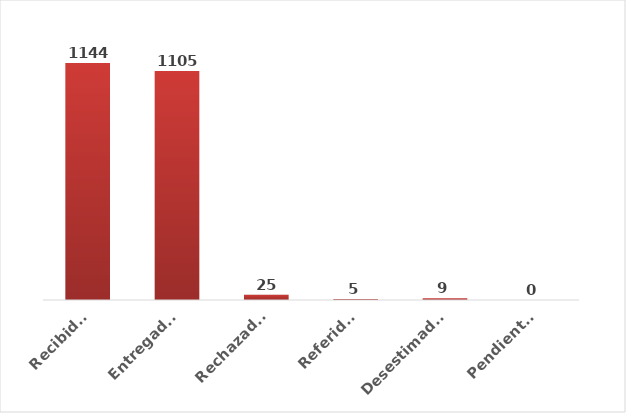
| Category | Series 0 |
|---|---|
| Recibidas | 1144 |
| Entregadas | 1105 |
| Rechazadas | 25 |
| Referidas | 5 |
| Desestimadas | 9 |
| Pendientes | 0 |